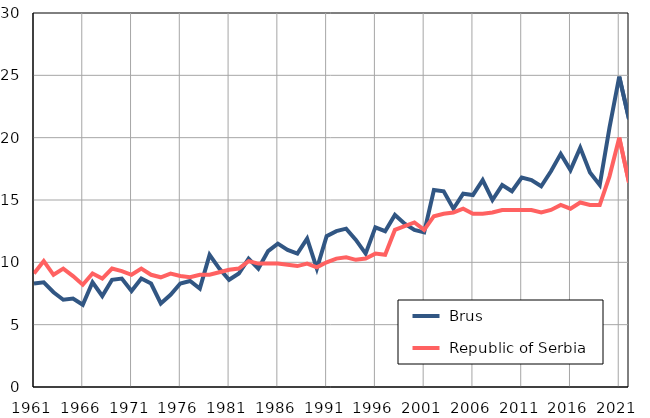
| Category |  Brus |  Republic of Serbia |
|---|---|---|
| 1961.0 | 8.3 | 9.1 |
| 1962.0 | 8.4 | 10.1 |
| 1963.0 | 7.6 | 9 |
| 1964.0 | 7 | 9.5 |
| 1965.0 | 7.1 | 8.9 |
| 1966.0 | 6.6 | 8.2 |
| 1967.0 | 8.4 | 9.1 |
| 1968.0 | 7.3 | 8.7 |
| 1969.0 | 8.6 | 9.5 |
| 1970.0 | 8.7 | 9.3 |
| 1971.0 | 7.7 | 9 |
| 1972.0 | 8.7 | 9.5 |
| 1973.0 | 8.3 | 9 |
| 1974.0 | 6.7 | 8.8 |
| 1975.0 | 7.4 | 9.1 |
| 1976.0 | 8.3 | 8.9 |
| 1977.0 | 8.5 | 8.8 |
| 1978.0 | 7.9 | 9 |
| 1979.0 | 10.6 | 9 |
| 1980.0 | 9.5 | 9.2 |
| 1981.0 | 8.6 | 9.4 |
| 1982.0 | 9.1 | 9.5 |
| 1983.0 | 10.3 | 10.1 |
| 1984.0 | 9.5 | 9.9 |
| 1985.0 | 10.9 | 9.9 |
| 1986.0 | 11.5 | 9.9 |
| 1987.0 | 11 | 9.8 |
| 1988.0 | 10.7 | 9.7 |
| 1989.0 | 11.9 | 9.9 |
| 1990.0 | 9.5 | 9.6 |
| 1991.0 | 12.1 | 10 |
| 1992.0 | 12.5 | 10.3 |
| 1993.0 | 12.7 | 10.4 |
| 1994.0 | 11.8 | 10.2 |
| 1995.0 | 10.7 | 10.3 |
| 1996.0 | 12.8 | 10.7 |
| 1997.0 | 12.5 | 10.6 |
| 1998.0 | 13.8 | 12.6 |
| 1999.0 | 13.1 | 12.9 |
| 2000.0 | 12.6 | 13.2 |
| 2001.0 | 12.4 | 12.6 |
| 2002.0 | 15.8 | 13.7 |
| 2003.0 | 15.7 | 13.9 |
| 2004.0 | 14.3 | 14 |
| 2005.0 | 15.5 | 14.3 |
| 2006.0 | 15.4 | 13.9 |
| 2007.0 | 16.6 | 13.9 |
| 2008.0 | 15 | 14 |
| 2009.0 | 16.2 | 14.2 |
| 2010.0 | 15.7 | 14.2 |
| 2011.0 | 16.8 | 14.2 |
| 2012.0 | 16.6 | 14.2 |
| 2013.0 | 16.1 | 14 |
| 2014.0 | 17.3 | 14.2 |
| 2015.0 | 18.7 | 14.6 |
| 2016.0 | 17.4 | 14.3 |
| 2017.0 | 19.2 | 14.8 |
| 2018.0 | 17.2 | 14.6 |
| 2019.0 | 16.2 | 14.6 |
| 2020.0 | 20.8 | 16.9 |
| 2021.0 | 24.9 | 20 |
| 2022.0 | 21.5 | 16.4 |